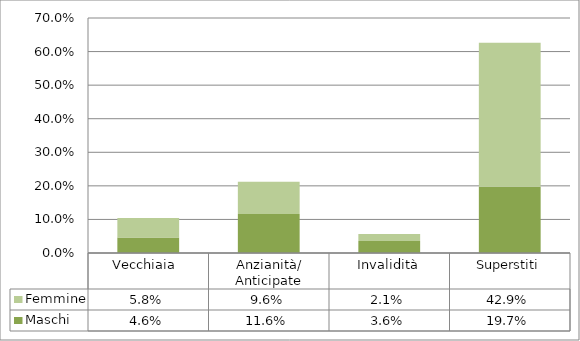
| Category | Maschi | Femmine |
|---|---|---|
| Vecchiaia  | 0.046 | 0.058 |
| Anzianità/ Anticipate | 0.116 | 0.096 |
| Invalidità | 0.036 | 0.021 |
| Superstiti | 0.197 | 0.429 |